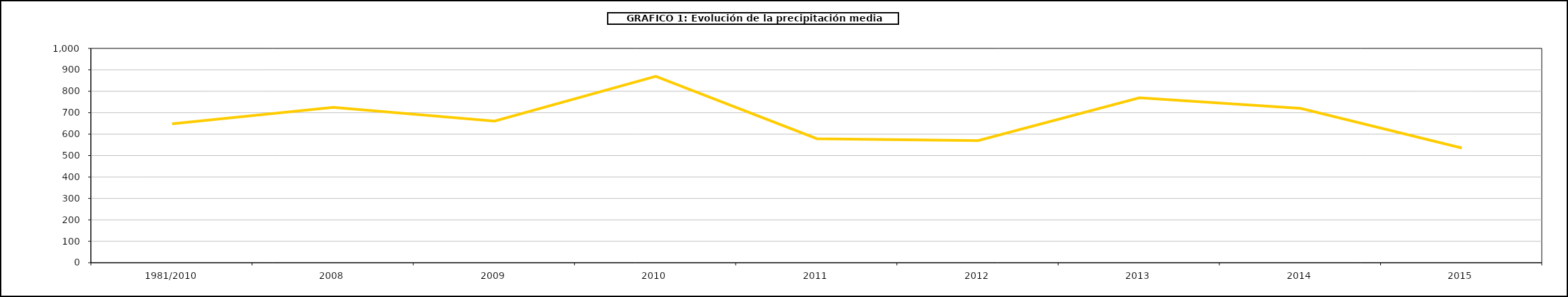
| Category | Series 0 |
|---|---|
| 1981/2010 | 648 |
| 2008 | 725 |
| 2009 | 661 |
| 2010 | 869.377 |
| 2011 | 578.444 |
| 2012 | 570.087 |
| 2013 | 769.551 |
| 2014 | 720.348 |
| 2015 | 535.081 |